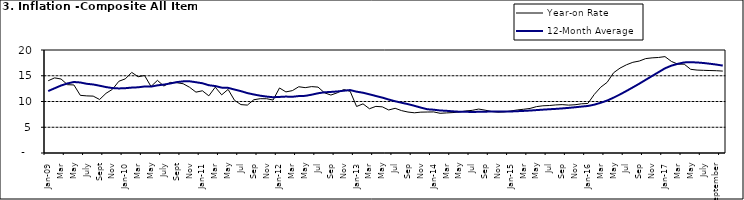
| Category | Year-on Rate | 12-Month Average |
|---|---|---|
| Jan-09 | 14.034 | 12.032 |
| Feb | 14.584 | 12.567 |
| Mar | 14.366 | 13.101 |
| Apr | 13.268 | 13.51 |
| May | 13.212 | 13.787 |
| June | 11.194 | 13.694 |
| July | 11.09 | 13.437 |
| Aug | 11.046 | 13.307 |
| Sept | 10.39 | 13.065 |
| Oct | 11.588 | 12.803 |
| Nov | 12.368 | 12.609 |
| Dec | 13.93 | 12.538 |
| Jan-10 | 14.398 | 12.586 |
| Feb | 15.649 | 12.7 |
| Mar | 14.812 | 12.757 |
| Apr | 15.044 | 12.915 |
| May | 12.915 | 12.893 |
| June | 14.099 | 13.132 |
| July | 13.002 | 13.284 |
| Aug | 13.702 | 13.5 |
| Sept | 13.65 | 13.764 |
| Oct | 13.45 | 13.908 |
| Nov | 12.766 | 13.928 |
| Dec | 11.815 | 13.74 |
| Jan-11 | 12.08 | 13.542 |
| Feb | 11.1 | 13.161 |
| Mar | 12.779 | 13.001 |
| Apr | 11.291 | 12.694 |
| May | 12.352 | 12.648 |
| Jun | 10.23 | 12.321 |
| Jul | 9.397 | 12.009 |
| Aug | 9.301 | 11.635 |
| Sep | 10.339 | 11.363 |
| Oct | 10.544 | 11.13 |
| Nov | 10.54 | 10.952 |
| Dec | 10.283 | 10.826 |
| Jan-12 | 12.626 | 10.886 |
| Feb | 11.866 | 10.955 |
| Mar | 12.111 | 10.914 |
| Apr | 12.866 | 11.054 |
| May | 12.688 | 11.096 |
| Jun | 12.892 | 11.32 |
| Jul | 12.797 | 11.599 |
| Aug | 11.689 | 11.791 |
| Sep | 11.253 | 11.859 |
| Oct | 11.693 | 11.948 |
| Nov | 12.32 | 12.091 |
| Dec | 11.981 | 12.224 |
| Jan-13 | 9.031 | 11.908 |
| Feb | 9.542 | 11.703 |
| Mar | 8.593 | 11.394 |
| Apr | 9.052 | 11.072 |
| May | 8.964 | 10.761 |
| Jun | 8.353 | 10.383 |
| Jul | 8.682 | 10.047 |
| Aug | 8.231 | 9.761 |
| Sep | 7.952 | 9.486 |
| Oct | 7.807 | 9.167 |
| Nov | 7.931 | 8.815 |
| Dec | 7.957 | 8.496 |
| Jan-14 | 7.977 | 8.408 |
| Feb | 7.707 | 8.257 |
| Mar | 7.783 | 8.19 |
| Apr | 7.851 | 8.092 |
| May | 7.965 | 8.012 |
| Jun | 8.167 | 7.998 |
| Jul | 8.281 | 7.968 |
| Aug | 8.534 | 7.996 |
| Sep | 8.317 | 8.027 |
| Oct | 8.06 | 8.047 |
| Nov | 7.927 | 8.046 |
| Dec | 7.978 | 8.047 |
| Jan-15 | 8.157 | 8.063 |
| Feb | 8.359 | 8.117 |
| Mar | 8.494 | 8.176 |
| Apr | 8.655 | 8.243 |
| May | 9.003 | 8.331 |
| Jun | 9.168 | 8.417 |
| Jul | 9.218 | 8.497 |
| Aug | 9.336 | 8.566 |
| Sep | 9.394 | 8.658 |
| Oct | 9.296 | 8.76 |
| Nov | 9.368 | 8.879 |
| Dec | 9.554 | 9.009 |
| Jan-16 | 9.617 | 9.13 |
| Feb | 11.379 | 9.386 |
| Mar | 12.775 | 9.751 |
| Apr | 13.721 | 10.182 |
| May | 15.577 | 10.746 |
| Jun | 16.48 | 11.372 |
| Jul | 17.127 | 12.045 |
| Aug | 17.609 | 12.744 |
| Sep | 17.852 | 13.454 |
| Oct | 18.33 | 14.206 |
| Nov | 18.476 | 14.958 |
| Dec | 18.547 | 15.697 |
| Jan-17 | 18.719 | 16.441 |
| Feb | 17.78 | 16.958 |
| Mar | 17.256 | 17.315 |
| Apr | 17.244 | 17.591 |
| May | 16.251 | 17.628 |
| June | 16.098 | 17.578 |
| July | 16.053 | 17.475 |
| August | 16.012 | 17.331 |
| September | 15.979 | 17.17 |
| October | 15.905 | 16.968 |